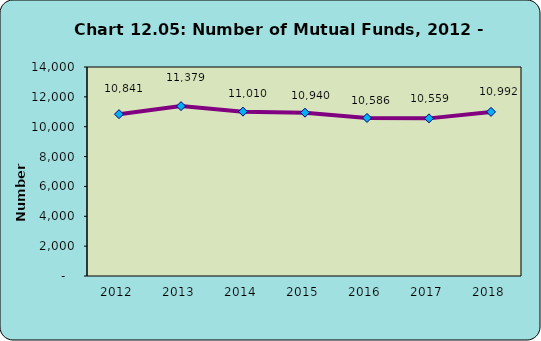
| Category | Total Mutual Funds |
|---|---|
| 2012.0 | 10841 |
| 2013.0 | 11379 |
| 2014.0 | 11010 |
| 2015.0 | 10940 |
| 2016.0 | 10586 |
| 2017.0 | 10559 |
| 2018.0 | 10992 |